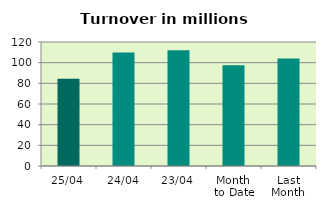
| Category | Series 0 |
|---|---|
| 25/04 | 84.367 |
| 24/04 | 109.777 |
| 23/04 | 112.006 |
| Month 
to Date | 97.568 |
| Last
Month | 104.085 |